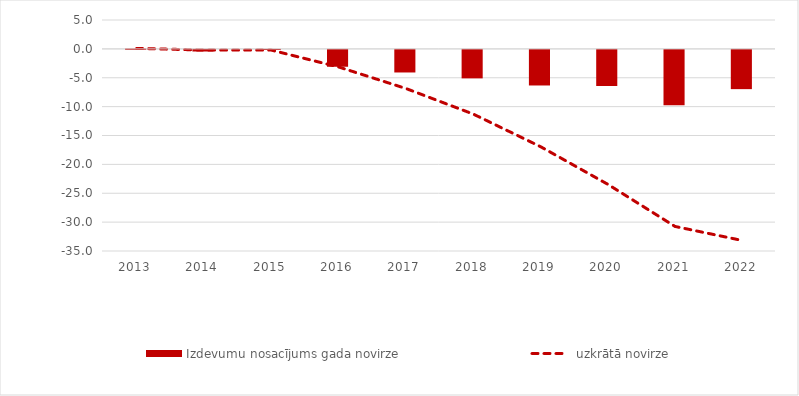
| Category | Izdevumu nosacījums |
|---|---|
| 2013.0 | 0.081 |
| 2014.0 | -0.282 |
| 2015.0 | -0.018 |
| 2016.0 | -2.923 |
| 2017.0 | -3.914 |
| 2018.0 | -4.935 |
| 2019.0 | -6.166 |
| 2020.0 | -6.261 |
| 2021.0 | -9.583 |
| 2022.0 | -6.799 |